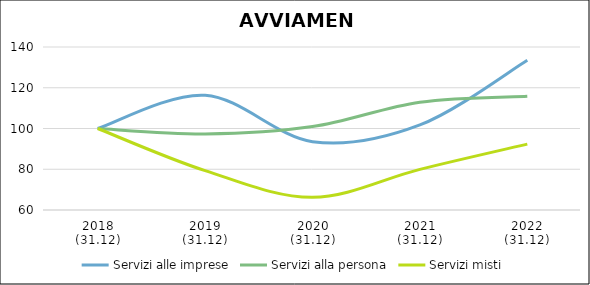
| Category | Servizi alle imprese | Servizi alla persona | Servizi misti |
|---|---|---|---|
| 2018
(31.12) | 100 | 100 | 100 |
| 2019
(31.12) | 116.305 | 97.315 | 79.317 |
| 2020
(31.12) | 93.537 | 100.931 | 66.209 |
| 2021
(31.12) | 101.759 | 112.897 | 79.958 |
| 2022
(31.12) | 133.511 | 115.838 | 92.344 |